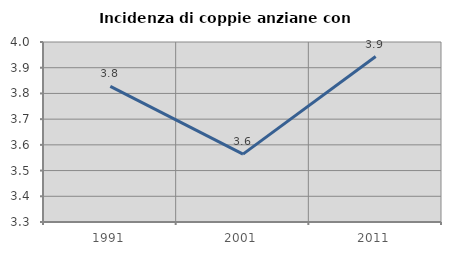
| Category | Incidenza di coppie anziane con figli |
|---|---|
| 1991.0 | 3.827 |
| 2001.0 | 3.564 |
| 2011.0 | 3.944 |